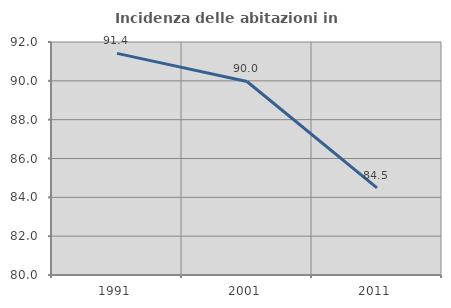
| Category | Incidenza delle abitazioni in proprietà  |
|---|---|
| 1991.0 | 91.415 |
| 2001.0 | 89.966 |
| 2011.0 | 84.488 |